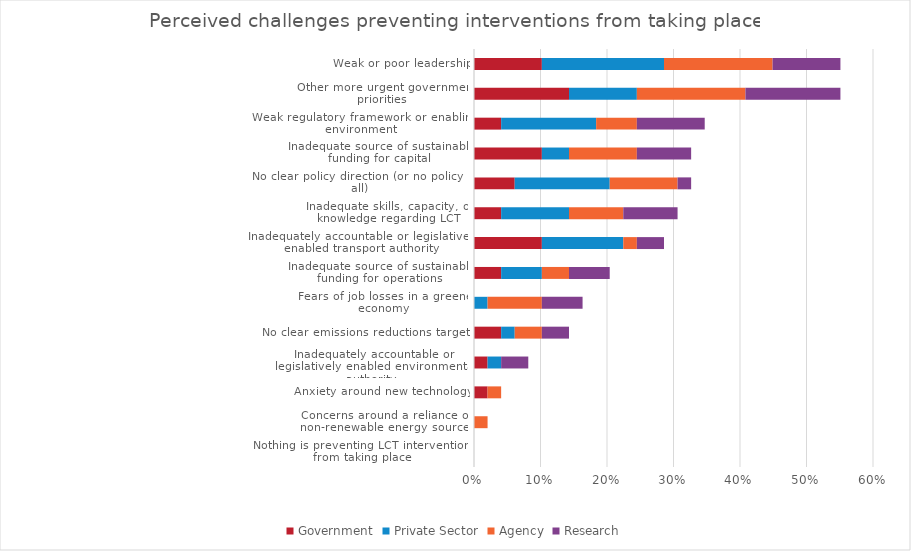
| Category | Government | Private Sector | Agency | Research |
|---|---|---|---|---|
| Nothing is preventing LCT interventions from taking place | 0 | 0 | 0 | 0 |
| Concerns around a reliance on non-renewable energy sources | 0 | 0 | 0.02 | 0 |
| Anxiety around new technology | 0.02 | 0 | 0.02 | 0 |
| Inadequately accountable or legislatively enabled environmental authority | 0.02 | 0.02 | 0 | 0.041 |
| No clear emissions reductions targets | 0.041 | 0.02 | 0.041 | 0.041 |
| Fears of job losses in a greener economy | 0 | 0.02 | 0.082 | 0.061 |
| Inadequate source of sustainable funding for operations | 0.041 | 0.061 | 0.041 | 0.061 |
| Inadequately accountable or legislatively enabled transport authority | 0.102 | 0.122 | 0.02 | 0.041 |
| Inadequate skills, capacity, or knowledge regarding LCT | 0.041 | 0.102 | 0.082 | 0.082 |
| No clear policy direction (or no policy at all) | 0.061 | 0.143 | 0.102 | 0.02 |
| Inadequate source of sustainable funding for capital | 0.102 | 0.041 | 0.102 | 0.082 |
| Weak regulatory framework or enabling environment | 0.041 | 0.143 | 0.061 | 0.102 |
| Other more urgent government priorities | 0.143 | 0.102 | 0.163 | 0.143 |
| Weak or poor leadership | 0.102 | 0.184 | 0.163 | 0.102 |